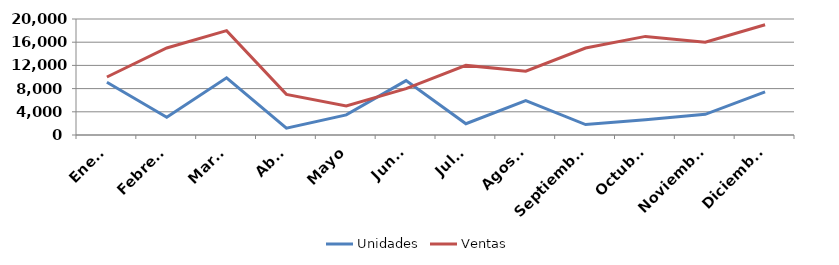
| Category | Unidades | Ventas |
|---|---|---|
| Enero | 9090 | 10000 |
| Febrero | 3060 | 15000 |
| Marzo | 9850 | 18000 |
| Abril | 1180 | 7000 |
| Mayo | 3470 | 5000 |
| Junio | 9370 | 8000 |
| Julio | 1940 | 12000 |
| Agosto | 5910 | 11000 |
| Septiembre | 1800 | 15000 |
| Octubre | 2620 | 17000 |
| Noviembre | 3570 | 16000 |
| Diciembre | 7430 | 19000 |